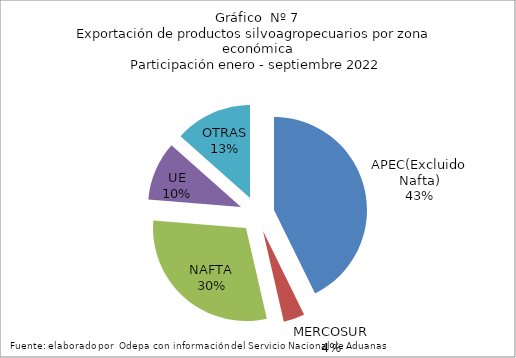
| Category | Series 0 |
|---|---|
| APEC(Excluido Nafta) | 5700236.605 |
| MERCOSUR | 491211.341 |
| NAFTA | 3989567.98 |
| UE | 1369603.519 |
| OTRAS | 1793234.555 |